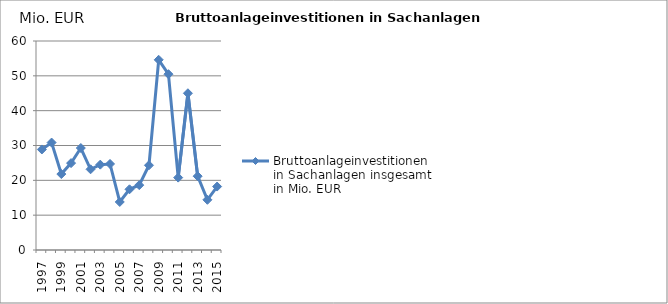
| Category | Bruttoanlageinvestitionen in Sachanlagen insgesamt in Mio. EUR |
|---|---|
| 1997.0 | 28.865 |
| 1998.0 | 30.842 |
| 1999.0 | 21.802 |
| 2000.0 | 24.946 |
| 2001.0 | 29.275 |
| 2002.0 | 23.169 |
| 2003.0 | 24.503 |
| 2004.0 | 24.7 |
| 2005.0 | 13.785 |
| 2006.0 | 17.429 |
| 2007.0 | 18.62 |
| 2008.0 | 24.327 |
| 2009.0 | 54.596 |
| 2010.0 | 50.471 |
| 2011.0 | 20.783 |
| 2012.0 | 45 |
| 2013.0 | 21.19 |
| 2014.0 | 14.408 |
| 2015.0 | 18.216 |